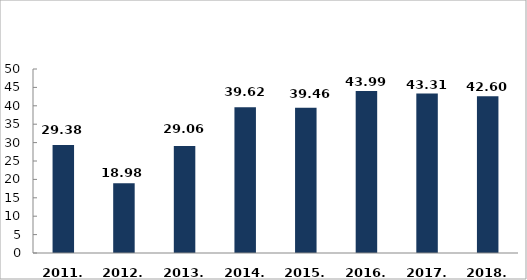
| Category | Series 1 |
|---|---|
| 2011. év | 29.38 |
| 2012. év | 18.98 |
| 2013. év | 29.06 |
| 2014. év | 39.62 |
| 2015. év | 39.46 |
| 2016. év | 43.99 |
| 2017. év | 43.31 |
| 2018. év | 42.6 |